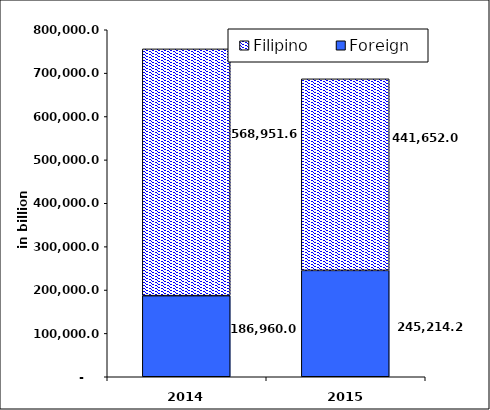
| Category | Foreign | Filipino |
|---|---|---|
| 2014.0 | 186960.019 | 568951.647 |
| 2015.0 | 245214.152 | 441651.967 |